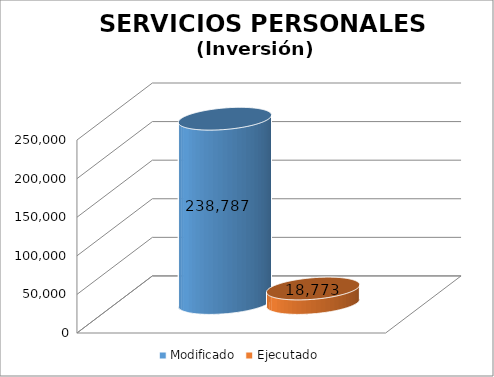
| Category | Modificado | Ejecutado |
|---|---|---|
| 0 | 238787 | 18772.72 |